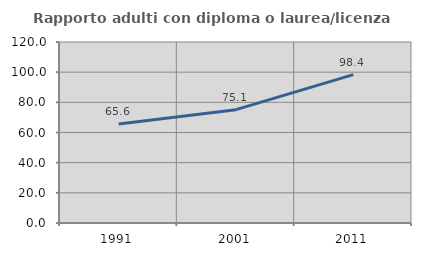
| Category | Rapporto adulti con diploma o laurea/licenza media  |
|---|---|
| 1991.0 | 65.616 |
| 2001.0 | 75.134 |
| 2011.0 | 98.363 |